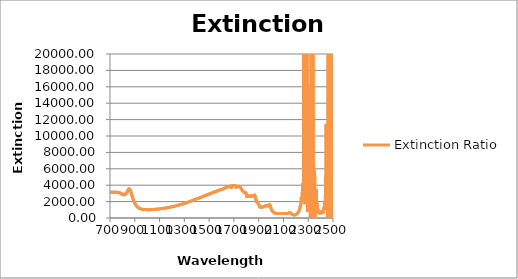
| Category | Extinction Ratio |
|---|---|
| 700.0 | 3127.245 |
| 702.0 | 3093.893 |
| 704.0 | 3142.239 |
| 706.0 | 3117.187 |
| 708.0 | 3146.489 |
| 710.0 | 3140.706 |
| 712.0 | 3144.462 |
| 714.0 | 3130.519 |
| 716.0 | 3143.259 |
| 718.0 | 3122.791 |
| 720.0 | 3138.432 |
| 722.0 | 3124.853 |
| 724.0 | 3112.545 |
| 726.0 | 3136.097 |
| 728.0 | 3145.45 |
| 730.0 | 3160.35 |
| 732.0 | 3121.396 |
| 734.0 | 3147.1 |
| 736.0 | 3139.196 |
| 738.0 | 3110.525 |
| 740.0 | 3129.82 |
| 742.0 | 3153.571 |
| 744.0 | 3115.266 |
| 746.0 | 3094.205 |
| 748.0 | 3129.182 |
| 750.0 | 3141.604 |
| 752.0 | 3141.948 |
| 754.0 | 3116.197 |
| 756.0 | 3131.701 |
| 758.0 | 3133.888 |
| 760.0 | 3128.949 |
| 762.0 | 3111.991 |
| 764.0 | 3110.509 |
| 766.0 | 3122.582 |
| 768.0 | 3102.832 |
| 770.0 | 3105.853 |
| 772.0 | 3108.033 |
| 774.0 | 3069.799 |
| 776.0 | 3048.562 |
| 778.0 | 3060.201 |
| 780.0 | 3045.661 |
| 782.0 | 3041.993 |
| 784.0 | 3031.769 |
| 786.0 | 3034.258 |
| 788.0 | 2999.718 |
| 790.0 | 2976.953 |
| 792.0 | 2938.808 |
| 794.0 | 2977.515 |
| 796.0 | 2930.408 |
| 798.0 | 2867.979 |
| 800.0 | 2897.511 |
| 802.0 | 2906.711 |
| 804.0 | 2883.122 |
| 806.0 | 2884.858 |
| 808.0 | 2847.216 |
| 810.0 | 2858.739 |
| 812.0 | 2829.855 |
| 814.0 | 2831.332 |
| 816.0 | 2833.756 |
| 818.0 | 2859.537 |
| 820.0 | 2864.933 |
| 822.0 | 2887.462 |
| 824.0 | 2924.673 |
| 826.0 | 2957.443 |
| 828.0 | 2968.467 |
| 830.0 | 2974.565 |
| 832.0 | 3034.566 |
| 834.0 | 3098.937 |
| 836.0 | 3154.243 |
| 838.0 | 3141.311 |
| 840.0 | 3184.747 |
| 842.0 | 3276.429 |
| 844.0 | 3293.699 |
| 846.0 | 3379.888 |
| 848.0 | 3482.595 |
| 850.0 | 3545.47 |
| 852.0 | 3435.064 |
| 854.0 | 3564.602 |
| 856.0 | 3449.039 |
| 858.0 | 3480.238 |
| 860.0 | 3433.71 |
| 862.0 | 3460.11 |
| 864.0 | 3352.736 |
| 866.0 | 3280.043 |
| 868.0 | 3216.541 |
| 870.0 | 3107.54 |
| 872.0 | 3008.264 |
| 874.0 | 2911.193 |
| 876.0 | 2810.128 |
| 878.0 | 2697.811 |
| 880.0 | 2575.327 |
| 882.0 | 2487.874 |
| 884.0 | 2402.076 |
| 886.0 | 2307.722 |
| 888.0 | 2218.517 |
| 890.0 | 2144.554 |
| 892.0 | 2070.044 |
| 894.0 | 1994.498 |
| 896.0 | 1924.541 |
| 898.0 | 1856.767 |
| 900.0 | 1797.155 |
| 902.0 | 1740.857 |
| 904.0 | 1685.966 |
| 906.0 | 1636.607 |
| 908.0 | 1590.72 |
| 910.0 | 1549.306 |
| 912.0 | 1508.632 |
| 914.0 | 1471.404 |
| 916.0 | 1435.955 |
| 918.0 | 1403.353 |
| 920.0 | 1372.461 |
| 922.0 | 1342.806 |
| 924.0 | 1316.559 |
| 926.0 | 1292.437 |
| 928.0 | 1269.449 |
| 930.0 | 1247.307 |
| 932.0 | 1229.18 |
| 934.0 | 1212.804 |
| 936.0 | 1197.241 |
| 938.0 | 1182.162 |
| 940.0 | 1167.654 |
| 942.0 | 1154.194 |
| 944.0 | 1141.514 |
| 946.0 | 1129.128 |
| 948.0 | 1117.872 |
| 950.0 | 1108.225 |
| 952.0 | 1100.37 |
| 954.0 | 1092.422 |
| 956.0 | 1084.865 |
| 958.0 | 1078.138 |
| 960.0 | 1072.405 |
| 962.0 | 1065.894 |
| 964.0 | 1059.874 |
| 966.0 | 1055.75 |
| 968.0 | 1052.354 |
| 970.0 | 1049.275 |
| 972.0 | 1045.547 |
| 974.0 | 1042.376 |
| 976.0 | 1039.31 |
| 978.0 | 1035.406 |
| 980.0 | 1031.799 |
| 982.0 | 1028.282 |
| 984.0 | 1025.495 |
| 986.0 | 1023.6 |
| 988.0 | 1023.039 |
| 990.0 | 1023.07 |
| 992.0 | 1022.486 |
| 994.0 | 1022.252 |
| 996.0 | 1021.507 |
| 998.0 | 1021.031 |
| 1000.0 | 1019.983 |
| 1002.0 | 1018.991 |
| 1004.0 | 1018.815 |
| 1006.0 | 1018.916 |
| 1008.0 | 1019.815 |
| 1010.0 | 1020.163 |
| 1012.0 | 1020.207 |
| 1014.0 | 1019.651 |
| 1016.0 | 1019.06 |
| 1018.0 | 1018.519 |
| 1020.0 | 1018.699 |
| 1022.0 | 1019.116 |
| 1024.0 | 1021.048 |
| 1026.0 | 1023.028 |
| 1028.0 | 1025.368 |
| 1030.0 | 1027.464 |
| 1032.0 | 1029.688 |
| 1034.0 | 1031.253 |
| 1036.0 | 1031.901 |
| 1038.0 | 1032.367 |
| 1040.0 | 1033.616 |
| 1042.0 | 1035.445 |
| 1044.0 | 1037.066 |
| 1046.0 | 1039.89 |
| 1048.0 | 1041.223 |
| 1050.0 | 1043.368 |
| 1052.0 | 1045.66 |
| 1054.0 | 1047.399 |
| 1056.0 | 1048.989 |
| 1058.0 | 1049.367 |
| 1060.0 | 1051.176 |
| 1062.0 | 1052.915 |
| 1064.0 | 1055.152 |
| 1066.0 | 1059.135 |
| 1068.0 | 1062.666 |
| 1070.0 | 1068.082 |
| 1072.0 | 1070.433 |
| 1074.0 | 1074.177 |
| 1076.0 | 1076.488 |
| 1078.0 | 1078.924 |
| 1080.0 | 1080.97 |
| 1082.0 | 1082.497 |
| 1084.0 | 1085.105 |
| 1086.0 | 1088.164 |
| 1088.0 | 1091.254 |
| 1090.0 | 1096.002 |
| 1092.0 | 1099.256 |
| 1094.0 | 1104.687 |
| 1096.0 | 1106.494 |
| 1098.0 | 1110.247 |
| 1100.0 | 1113.501 |
| 1102.0 | 1116.275 |
| 1104.0 | 1120.658 |
| 1106.0 | 1123.472 |
| 1108.0 | 1127.611 |
| 1110.0 | 1132.568 |
| 1112.0 | 1134.962 |
| 1114.0 | 1141.41 |
| 1116.0 | 1145.207 |
| 1118.0 | 1148.271 |
| 1120.0 | 1154.552 |
| 1122.0 | 1155.693 |
| 1124.0 | 1160.125 |
| 1126.0 | 1162.813 |
| 1128.0 | 1166.526 |
| 1130.0 | 1171.578 |
| 1132.0 | 1175.25 |
| 1134.0 | 1180.41 |
| 1136.0 | 1188.187 |
| 1138.0 | 1191.542 |
| 1140.0 | 1198.292 |
| 1142.0 | 1204.333 |
| 1144.0 | 1207.975 |
| 1146.0 | 1215.481 |
| 1148.0 | 1219.256 |
| 1150.0 | 1222.812 |
| 1152.0 | 1226.271 |
| 1154.0 | 1229.259 |
| 1156.0 | 1234.059 |
| 1158.0 | 1242.254 |
| 1160.0 | 1247.148 |
| 1162.0 | 1253.618 |
| 1164.0 | 1262.287 |
| 1166.0 | 1264.125 |
| 1168.0 | 1271.941 |
| 1170.0 | 1275.129 |
| 1172.0 | 1279.209 |
| 1174.0 | 1287.305 |
| 1176.0 | 1290.903 |
| 1178.0 | 1296.718 |
| 1180.0 | 1303.399 |
| 1182.0 | 1309.87 |
| 1184.0 | 1315.696 |
| 1186.0 | 1324.89 |
| 1188.0 | 1330.997 |
| 1190.0 | 1337.003 |
| 1192.0 | 1345.966 |
| 1194.0 | 1350.261 |
| 1196.0 | 1354.64 |
| 1198.0 | 1365.172 |
| 1200.0 | 1365.308 |
| 1202.0 | 1372.881 |
| 1204.0 | 1381.078 |
| 1206.0 | 1385.003 |
| 1208.0 | 1393.738 |
| 1210.0 | 1400.336 |
| 1212.0 | 1408.666 |
| 1214.0 | 1414.367 |
| 1216.0 | 1424.151 |
| 1218.0 | 1431.347 |
| 1220.0 | 1436.484 |
| 1222.0 | 1446.856 |
| 1224.0 | 1453.101 |
| 1226.0 | 1456.07 |
| 1228.0 | 1469.398 |
| 1230.0 | 1470.77 |
| 1232.0 | 1479.524 |
| 1234.0 | 1489.881 |
| 1236.0 | 1497.649 |
| 1238.0 | 1505.207 |
| 1240.0 | 1516.555 |
| 1242.0 | 1522.619 |
| 1244.0 | 1532.574 |
| 1246.0 | 1538.024 |
| 1248.0 | 1550.677 |
| 1250.0 | 1555.245 |
| 1252.0 | 1562.504 |
| 1254.0 | 1573.334 |
| 1256.0 | 1578.549 |
| 1258.0 | 1583.073 |
| 1260.0 | 1597.566 |
| 1262.0 | 1600.92 |
| 1264.0 | 1610.048 |
| 1266.0 | 1620.476 |
| 1268.0 | 1629.649 |
| 1270.0 | 1639.918 |
| 1272.0 | 1648.225 |
| 1274.0 | 1660.682 |
| 1276.0 | 1670.867 |
| 1278.0 | 1675.254 |
| 1280.0 | 1685.16 |
| 1282.0 | 1698.531 |
| 1284.0 | 1697.548 |
| 1286.0 | 1711.945 |
| 1288.0 | 1723.421 |
| 1290.0 | 1728.354 |
| 1292.0 | 1736.612 |
| 1294.0 | 1752.525 |
| 1296.0 | 1757.177 |
| 1298.0 | 1765.816 |
| 1300.0 | 1778.836 |
| 1302.0 | 1788.172 |
| 1304.0 | 1799.073 |
| 1306.0 | 1807.232 |
| 1308.0 | 1822.289 |
| 1310.0 | 1831.045 |
| 1312.0 | 1840.825 |
| 1314.0 | 1844.666 |
| 1316.0 | 1862.951 |
| 1318.0 | 1870.596 |
| 1320.0 | 1871.339 |
| 1322.0 | 1892.817 |
| 1324.0 | 1902.831 |
| 1326.0 | 1909.414 |
| 1328.0 | 1923.772 |
| 1330.0 | 1939.941 |
| 1332.0 | 1947.553 |
| 1334.0 | 1958.913 |
| 1336.0 | 1973.515 |
| 1338.0 | 1981.773 |
| 1340.0 | 1994.63 |
| 1342.0 | 1998.372 |
| 1344.0 | 2006.176 |
| 1346.0 | 2019.56 |
| 1348.0 | 2024.635 |
| 1350.0 | 2026.675 |
| 1352.0 | 2044.703 |
| 1354.0 | 2065.253 |
| 1356.0 | 2065.199 |
| 1358.0 | 2078.345 |
| 1360.0 | 2104.503 |
| 1362.0 | 2111.019 |
| 1364.0 | 2121.744 |
| 1366.0 | 2135.461 |
| 1368.0 | 2147.764 |
| 1370.0 | 2156.647 |
| 1372.0 | 2165.273 |
| 1374.0 | 2184.6 |
| 1376.0 | 2196.328 |
| 1378.0 | 2213.447 |
| 1380.0 | 2224.194 |
| 1382.0 | 2231.786 |
| 1384.0 | 2253.18 |
| 1386.0 | 2260.441 |
| 1388.0 | 2267.809 |
| 1390.0 | 2272.686 |
| 1392.0 | 2300.445 |
| 1394.0 | 2312.076 |
| 1396.0 | 2306.801 |
| 1398.0 | 2328.608 |
| 1400.0 | 2348.836 |
| 1402.0 | 2349.48 |
| 1404.0 | 2363.074 |
| 1406.0 | 2376.834 |
| 1408.0 | 2388.2 |
| 1410.0 | 2396.965 |
| 1412.0 | 2399.249 |
| 1414.0 | 2415.3 |
| 1416.0 | 2414.805 |
| 1418.0 | 2433.813 |
| 1420.0 | 2443.224 |
| 1422.0 | 2441.962 |
| 1424.0 | 2457.521 |
| 1426.0 | 2481.775 |
| 1428.0 | 2481.707 |
| 1430.0 | 2490.859 |
| 1432.0 | 2500.854 |
| 1434.0 | 2530.123 |
| 1436.0 | 2537.409 |
| 1438.0 | 2536.484 |
| 1440.0 | 2564.64 |
| 1442.0 | 2584.338 |
| 1444.0 | 2590.068 |
| 1446.0 | 2605.923 |
| 1448.0 | 2618.946 |
| 1450.0 | 2634.829 |
| 1452.0 | 2646.536 |
| 1454.0 | 2659.172 |
| 1456.0 | 2663.237 |
| 1458.0 | 2673.741 |
| 1460.0 | 2681.337 |
| 1462.0 | 2700.186 |
| 1464.0 | 2698.804 |
| 1466.0 | 2695.225 |
| 1468.0 | 2721.38 |
| 1470.0 | 2743.777 |
| 1472.0 | 2736.79 |
| 1474.0 | 2748.079 |
| 1476.0 | 2765.226 |
| 1478.0 | 2792.702 |
| 1480.0 | 2791.072 |
| 1482.0 | 2797.103 |
| 1484.0 | 2810.475 |
| 1486.0 | 2841.216 |
| 1488.0 | 2837.958 |
| 1490.0 | 2851.832 |
| 1492.0 | 2870.198 |
| 1494.0 | 2878.594 |
| 1496.0 | 2893.146 |
| 1498.0 | 2907.277 |
| 1500.0 | 2919.463 |
| 1502.0 | 2921.18 |
| 1504.0 | 2932.867 |
| 1506.0 | 2946.167 |
| 1508.0 | 2973.844 |
| 1510.0 | 2966.731 |
| 1512.0 | 2967.89 |
| 1514.0 | 2994.88 |
| 1516.0 | 3024.645 |
| 1518.0 | 3021.148 |
| 1520.0 | 3022.236 |
| 1522.0 | 3047.101 |
| 1524.0 | 3067.643 |
| 1526.0 | 3086.423 |
| 1528.0 | 3080.406 |
| 1530.0 | 3097.399 |
| 1532.0 | 3114.732 |
| 1534.0 | 3134.944 |
| 1536.0 | 3126.858 |
| 1538.0 | 3151.122 |
| 1540.0 | 3164.559 |
| 1542.0 | 3165.616 |
| 1544.0 | 3178.017 |
| 1546.0 | 3198.622 |
| 1548.0 | 3209.965 |
| 1550.0 | 3204.63 |
| 1552.0 | 3216.657 |
| 1554.0 | 3226.729 |
| 1556.0 | 3254.559 |
| 1558.0 | 3258.34 |
| 1560.0 | 3248.06 |
| 1562.0 | 3264.311 |
| 1564.0 | 3299.098 |
| 1566.0 | 3314.871 |
| 1568.0 | 3302.09 |
| 1570.0 | 3314.699 |
| 1572.0 | 3340.957 |
| 1574.0 | 3355.984 |
| 1576.0 | 3370.452 |
| 1578.0 | 3364.009 |
| 1580.0 | 3382.671 |
| 1582.0 | 3394.301 |
| 1584.0 | 3413.349 |
| 1586.0 | 3408.036 |
| 1588.0 | 3415.072 |
| 1590.0 | 3443.59 |
| 1592.0 | 3437.525 |
| 1594.0 | 3436.389 |
| 1596.0 | 3458.858 |
| 1598.0 | 3480.049 |
| 1600.0 | 3483.269 |
| 1602.0 | 3471.147 |
| 1604.0 | 3487.817 |
| 1606.0 | 3508.53 |
| 1608.0 | 3529.087 |
| 1610.0 | 3540.522 |
| 1612.0 | 3521.527 |
| 1614.0 | 3547.847 |
| 1616.0 | 3573.849 |
| 1618.0 | 3599.189 |
| 1620.0 | 3585.769 |
| 1622.0 | 3588.029 |
| 1624.0 | 3618.295 |
| 1626.0 | 3639.645 |
| 1628.0 | 3643.384 |
| 1630.0 | 3661.077 |
| 1632.0 | 3658.357 |
| 1634.0 | 3679.577 |
| 1636.0 | 3692.774 |
| 1638.0 | 3706.375 |
| 1640.0 | 3725.055 |
| 1642.0 | 3728.763 |
| 1644.0 | 3773.525 |
| 1646.0 | 3779.011 |
| 1648.0 | 3785.85 |
| 1650.0 | 3814.255 |
| 1652.0 | 3848.971 |
| 1654.0 | 3856.785 |
| 1656.0 | 3837.151 |
| 1658.0 | 3815.056 |
| 1660.0 | 3820.457 |
| 1662.0 | 3834.941 |
| 1664.0 | 3840.03 |
| 1666.0 | 3849.373 |
| 1668.0 | 3835.276 |
| 1670.0 | 3864.977 |
| 1672.0 | 3896.401 |
| 1674.0 | 3890.661 |
| 1676.0 | 3840.533 |
| 1678.0 | 3753.804 |
| 1680.0 | 3714.228 |
| 1682.0 | 3721.96 |
| 1684.0 | 3762.891 |
| 1686.0 | 3817.218 |
| 1688.0 | 3891.194 |
| 1690.0 | 3927.368 |
| 1692.0 | 3951.287 |
| 1694.0 | 3957.635 |
| 1696.0 | 3948.185 |
| 1698.0 | 3954.784 |
| 1700.0 | 3940.908 |
| 1702.0 | 3955.021 |
| 1704.0 | 3955.077 |
| 1706.0 | 3943.827 |
| 1708.0 | 3957.045 |
| 1710.0 | 3964.522 |
| 1712.0 | 3930.35 |
| 1714.0 | 3869.802 |
| 1716.0 | 3794.103 |
| 1718.0 | 3743.059 |
| 1720.0 | 3746.106 |
| 1722.0 | 3767.06 |
| 1724.0 | 3778.599 |
| 1726.0 | 3797.119 |
| 1728.0 | 3787.002 |
| 1730.0 | 3801.972 |
| 1732.0 | 3845.957 |
| 1734.0 | 3861.687 |
| 1736.0 | 3867.303 |
| 1738.0 | 3850.058 |
| 1740.0 | 3852.084 |
| 1742.0 | 3860.989 |
| 1744.0 | 3848.144 |
| 1746.0 | 3814.424 |
| 1748.0 | 3790.964 |
| 1750.0 | 3764.052 |
| 1752.0 | 3735.772 |
| 1754.0 | 3687.274 |
| 1756.0 | 3649.357 |
| 1758.0 | 3599.401 |
| 1760.0 | 3560.22 |
| 1762.0 | 3517.105 |
| 1764.0 | 3469.568 |
| 1766.0 | 3431.709 |
| 1768.0 | 3369.016 |
| 1770.0 | 3315.792 |
| 1772.0 | 3293.875 |
| 1774.0 | 3274.31 |
| 1776.0 | 3245.508 |
| 1778.0 | 3193.463 |
| 1780.0 | 3152.659 |
| 1782.0 | 3132.204 |
| 1784.0 | 3122.158 |
| 1786.0 | 3114.955 |
| 1788.0 | 3085.703 |
| 1790.0 | 3069.903 |
| 1792.0 | 3052.559 |
| 1794.0 | 3032.089 |
| 1796.0 | 3039.153 |
| 1798.0 | 3049.502 |
| 1800.0 | 3048.471 |
| 1802.0 | 2636.473 |
| 1804.0 | 2660.988 |
| 1806.0 | 2673.836 |
| 1808.0 | 2625.11 |
| 1810.0 | 2657.279 |
| 1812.0 | 2692.058 |
| 1814.0 | 2680.442 |
| 1816.0 | 2689.504 |
| 1818.0 | 2658.208 |
| 1820.0 | 2637.14 |
| 1822.0 | 2667.464 |
| 1824.0 | 2675.668 |
| 1826.0 | 2689.543 |
| 1828.0 | 2646.402 |
| 1830.0 | 2710.568 |
| 1832.0 | 2688.284 |
| 1834.0 | 2684.075 |
| 1836.0 | 2637.536 |
| 1838.0 | 2687.733 |
| 1840.0 | 2657.845 |
| 1842.0 | 2662.231 |
| 1844.0 | 2648.611 |
| 1846.0 | 2653.238 |
| 1848.0 | 2645.968 |
| 1850.0 | 2696.1 |
| 1852.0 | 2692.807 |
| 1854.0 | 2663.661 |
| 1856.0 | 2714.162 |
| 1858.0 | 2697.652 |
| 1860.0 | 2704.015 |
| 1862.0 | 2763.345 |
| 1864.0 | 2756.043 |
| 1866.0 | 2820.89 |
| 1868.0 | 2754.437 |
| 1870.0 | 2708 |
| 1872.0 | 2581.207 |
| 1874.0 | 2495.422 |
| 1876.0 | 2403.187 |
| 1878.0 | 2214.925 |
| 1880.0 | 2174.866 |
| 1882.0 | 2064.203 |
| 1884.0 | 1995.56 |
| 1886.0 | 2017.503 |
| 1888.0 | 1955.212 |
| 1890.0 | 1861.93 |
| 1892.0 | 1832.541 |
| 1894.0 | 1822.962 |
| 1896.0 | 1748.553 |
| 1898.0 | 1700.527 |
| 1900.0 | 1648.865 |
| 1902.0 | 1561.466 |
| 1904.0 | 1504.209 |
| 1906.0 | 1453.343 |
| 1908.0 | 1433.964 |
| 1910.0 | 1320.394 |
| 1912.0 | 1359.543 |
| 1914.0 | 1329.762 |
| 1916.0 | 1361.713 |
| 1918.0 | 1327.499 |
| 1920.0 | 1338.834 |
| 1922.0 | 1305.452 |
| 1924.0 | 1306.193 |
| 1926.0 | 1322.258 |
| 1928.0 | 1332.555 |
| 1930.0 | 1325.197 |
| 1932.0 | 1336.892 |
| 1934.0 | 1343.901 |
| 1936.0 | 1347.926 |
| 1938.0 | 1359.316 |
| 1940.0 | 1380.126 |
| 1942.0 | 1375.038 |
| 1944.0 | 1399.373 |
| 1946.0 | 1420.828 |
| 1948.0 | 1447.915 |
| 1950.0 | 1457.649 |
| 1952.0 | 1456.83 |
| 1954.0 | 1460.945 |
| 1956.0 | 1496.599 |
| 1958.0 | 1475.155 |
| 1960.0 | 1490.293 |
| 1962.0 | 1518.644 |
| 1964.0 | 1490.608 |
| 1966.0 | 1490.202 |
| 1968.0 | 1477.12 |
| 1970.0 | 1466.179 |
| 1972.0 | 1466.961 |
| 1974.0 | 1455.079 |
| 1976.0 | 1481.666 |
| 1978.0 | 1468.992 |
| 1980.0 | 1539.689 |
| 1982.0 | 1573.85 |
| 1984.0 | 1619.175 |
| 1986.0 | 1598.524 |
| 1988.0 | 1604.923 |
| 1990.0 | 1596.42 |
| 1992.0 | 1569.8 |
| 1994.0 | 1474.075 |
| 1996.0 | 1382.871 |
| 1998.0 | 1283.107 |
| 2000.0 | 1193.362 |
| 2002.0 | 1089.669 |
| 2004.0 | 1023.908 |
| 2006.0 | 953.974 |
| 2008.0 | 900.224 |
| 2010.0 | 860.145 |
| 2012.0 | 814.56 |
| 2014.0 | 782.551 |
| 2016.0 | 745.534 |
| 2018.0 | 720.667 |
| 2020.0 | 698.82 |
| 2022.0 | 671.12 |
| 2024.0 | 658.231 |
| 2026.0 | 638.311 |
| 2028.0 | 623.36 |
| 2030.0 | 603.146 |
| 2032.0 | 589.946 |
| 2034.0 | 583.307 |
| 2036.0 | 576.161 |
| 2038.0 | 574.004 |
| 2040.0 | 558.416 |
| 2042.0 | 553.712 |
| 2044.0 | 549.178 |
| 2046.0 | 552.419 |
| 2048.0 | 547.27 |
| 2050.0 | 545.362 |
| 2052.0 | 542.803 |
| 2054.0 | 545.289 |
| 2056.0 | 543.586 |
| 2058.0 | 539.475 |
| 2060.0 | 544.746 |
| 2062.0 | 541.777 |
| 2064.0 | 544.199 |
| 2066.0 | 544.535 |
| 2068.0 | 546.954 |
| 2070.0 | 546.668 |
| 2072.0 | 544.671 |
| 2074.0 | 550.211 |
| 2076.0 | 547.003 |
| 2078.0 | 553.017 |
| 2080.0 | 549.402 |
| 2082.0 | 553.163 |
| 2084.0 | 547.909 |
| 2086.0 | 550.766 |
| 2088.0 | 555.242 |
| 2090.0 | 544.773 |
| 2092.0 | 547.963 |
| 2094.0 | 550.43 |
| 2096.0 | 547.915 |
| 2098.0 | 560.778 |
| 2100.0 | 551.59 |
| 2102.0 | 552.417 |
| 2104.0 | 555.668 |
| 2106.0 | 546.736 |
| 2108.0 | 550.968 |
| 2110.0 | 554.313 |
| 2112.0 | 556.521 |
| 2114.0 | 548.491 |
| 2116.0 | 546.359 |
| 2118.0 | 551.417 |
| 2120.0 | 552.381 |
| 2122.0 | 545.715 |
| 2124.0 | 553.423 |
| 2126.0 | 540.071 |
| 2128.0 | 536.719 |
| 2130.0 | 540.32 |
| 2132.0 | 549.562 |
| 2134.0 | 548.131 |
| 2136.0 | 564.16 |
| 2138.0 | 572.774 |
| 2140.0 | 586.167 |
| 2142.0 | 592.587 |
| 2144.0 | 631.877 |
| 2146.0 | 632.09 |
| 2148.0 | 643.591 |
| 2150.0 | 638.313 |
| 2152.0 | 644.203 |
| 2154.0 | 642.694 |
| 2156.0 | 616.185 |
| 2158.0 | 597.392 |
| 2160.0 | 562.738 |
| 2162.0 | 545.371 |
| 2164.0 | 528.395 |
| 2166.0 | 507.491 |
| 2168.0 | 474.108 |
| 2170.0 | 451.304 |
| 2172.0 | 435.315 |
| 2174.0 | 418.935 |
| 2176.0 | 405.67 |
| 2178.0 | 393.635 |
| 2180.0 | 384.702 |
| 2182.0 | 376.87 |
| 2184.0 | 370.917 |
| 2186.0 | 373.241 |
| 2188.0 | 367.841 |
| 2190.0 | 367.763 |
| 2192.0 | 375.379 |
| 2194.0 | 377.908 |
| 2196.0 | 388.495 |
| 2198.0 | 400.388 |
| 2200.0 | 414.105 |
| 2202.0 | 434.415 |
| 2204.0 | 448.322 |
| 2206.0 | 469.451 |
| 2208.0 | 481.027 |
| 2210.0 | 527.946 |
| 2212.0 | 541.766 |
| 2214.0 | 573.576 |
| 2216.0 | 625.343 |
| 2218.0 | 676.401 |
| 2220.0 | 723.023 |
| 2222.0 | 777.54 |
| 2224.0 | 801.83 |
| 2226.0 | 887.127 |
| 2228.0 | 994.066 |
| 2230.0 | 1060.389 |
| 2232.0 | 1174.32 |
| 2234.0 | 1361.782 |
| 2236.0 | 1382.631 |
| 2238.0 | 1583.857 |
| 2240.0 | 1654.453 |
| 2242.0 | 1770.678 |
| 2244.0 | 2487.35 |
| 2246.0 | 2122.605 |
| 2248.0 | 2125.094 |
| 2250.0 | 2371.48 |
| 2252.0 | 2396.852 |
| 2254.0 | 4158.801 |
| 2256.0 | 2483.603 |
| 2258.0 | 3294.172 |
| 2260.0 | 3743.859 |
| 2262.0 | 4814.029 |
| 2264.0 | 20032.39 |
| 2266.0 | 2861.318 |
| 2268.0 | 3953.264 |
| 2270.0 | 1899.425 |
| 2272.0 | 7343.046 |
| 2274.0 | 3665.13 |
| 2276.0 | 3143.251 |
| 2278.0 | 2474.5 |
| 2280.0 | 6883.858 |
| 2282.0 | 3543.289 |
| 2284.0 | 13438.833 |
| 2286.0 | 9625.265 |
| 2288.0 | 3651.049 |
| 2290.0 | 32889.524 |
| 2292.0 | 2920.595 |
| 2294.0 | 3534.561 |
| 2296.0 | 3304.731 |
| 2298.0 | 7534.331 |
| 2300.0 | 1893.226 |
| 2302.0 | 4079.602 |
| 2304.0 | 3446.933 |
| 2306.0 | 6614.932 |
| 2308.0 | 4854.824 |
| 2310.0 | 2325.012 |
| 2312.0 | 14372.195 |
| 2314.0 | 15062.488 |
| 2316.0 | 5249.569 |
| 2318.0 | -23815.521 |
| 2320.0 | 8106.424 |
| 2322.0 | 3204.804 |
| 2324.0 | 66296.254 |
| 2326.0 | 4578.671 |
| 2328.0 | 4067.706 |
| 2330.0 | 5790.287 |
| 2332.0 | 6872.507 |
| 2334.0 | 2498.814 |
| 2336.0 | 3962.628 |
| 2338.0 | 21044.365 |
| 2340.0 | 8871.821 |
| 2342.0 | 4740.557 |
| 2344.0 | 2416.137 |
| 2346.0 | 4911.279 |
| 2348.0 | -21373.086 |
| 2350.0 | 2118.456 |
| 2352.0 | 4981.658 |
| 2354.0 | -4712.435 |
| 2356.0 | 2205.747 |
| 2358.0 | 2181.716 |
| 2360.0 | 3180.042 |
| 2362.0 | 3021.625 |
| 2364.0 | 1725.687 |
| 2366.0 | 3415.815 |
| 2368.0 | 1270.748 |
| 2370.0 | 925.317 |
| 2372.0 | 1833.601 |
| 2374.0 | 1220.563 |
| 2376.0 | 1003.177 |
| 2378.0 | 982.46 |
| 2380.0 | 687.23 |
| 2382.0 | 601.905 |
| 2384.0 | 654.251 |
| 2386.0 | 670.533 |
| 2388.0 | 691.857 |
| 2390.0 | 715.236 |
| 2392.0 | 589.847 |
| 2394.0 | 788.36 |
| 2396.0 | 625.398 |
| 2398.0 | 672.419 |
| 2400.0 | 630.767 |
| 2402.0 | 631.593 |
| 2404.0 | 613.418 |
| 2406.0 | 605.493 |
| 2408.0 | 711.108 |
| 2410.0 | 661.282 |
| 2412.0 | 631.597 |
| 2414.0 | 757.515 |
| 2416.0 | 681.689 |
| 2418.0 | 880.155 |
| 2420.0 | 739.089 |
| 2422.0 | 724.195 |
| 2424.0 | 986.137 |
| 2426.0 | 1139.515 |
| 2428.0 | 1329.02 |
| 2430.0 | 1131.443 |
| 2432.0 | 1973.033 |
| 2434.0 | 1721.065 |
| 2436.0 | 1184.529 |
| 2438.0 | 2716.422 |
| 2440.0 | 2582.064 |
| 2442.0 | 11318.617 |
| 2444.0 | 4556.555 |
| 2446.0 | 2285.457 |
| 2448.0 | 4364.371 |
| 2450.0 | 3800.964 |
| 2452.0 | 5304.226 |
| 2454.0 | -7572.645 |
| 2456.0 | 2738.675 |
| 2458.0 | 4748.929 |
| 2460.0 | 51779.714 |
| 2462.0 | 3054.891 |
| 2464.0 | 4921.806 |
| 2466.0 | 1117.921 |
| 2468.0 | -8435.334 |
| 2470.0 | 1345.014 |
| 2472.0 | -4692.856 |
| 2474.0 | 3525.457 |
| 2476.0 | 26759.747 |
| 2478.0 | 1403.78 |
| 2480.0 | 12085.895 |
| 2482.0 | 7277.616 |
| 2484.0 | 6817.772 |
| 2486.0 | -24510.671 |
| 2488.0 | 3019.092 |
| 2490.0 | 20360.835 |
| 2492.0 | 1988.083 |
| 2494.0 | 3638.24 |
| 2496.0 | 31634.457 |
| 2498.0 | 11692.587 |
| 2500.0 | 2131.047 |